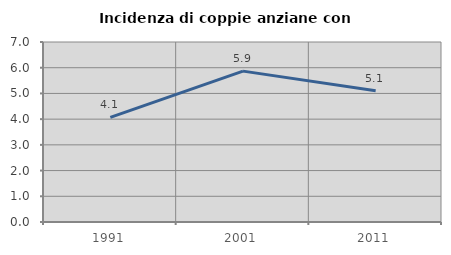
| Category | Incidenza di coppie anziane con figli |
|---|---|
| 1991.0 | 4.066 |
| 2001.0 | 5.867 |
| 2011.0 | 5.106 |